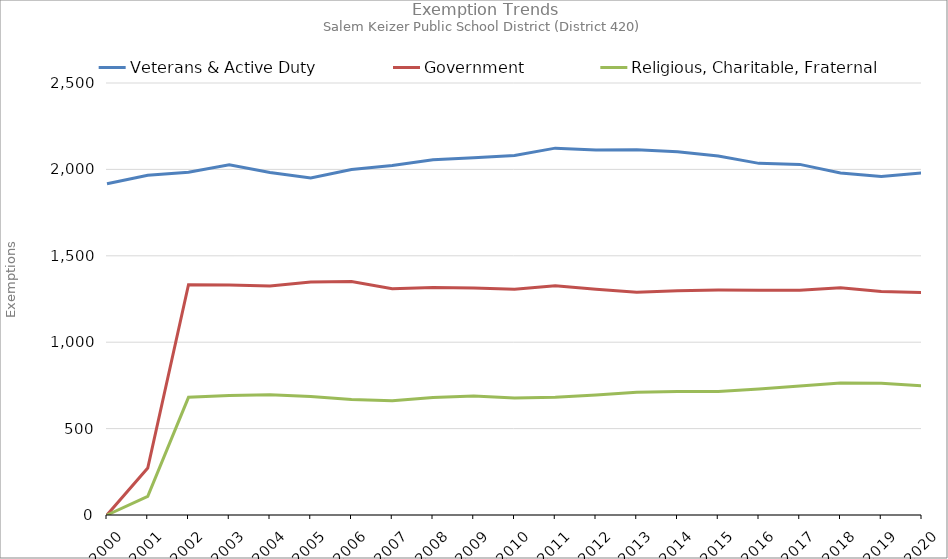
| Category | Veterans & Active Duty | Government | Religious, Charitable, Fraternal |
|---|---|---|---|
| 2000.0 | 1917 | 0 | 0 |
| 2001.0 | 1966 | 272 | 108 |
| 2002.0 | 1984 | 1333 | 681 |
| 2003.0 | 2027 | 1331 | 691 |
| 2004.0 | 1982 | 1325 | 696 |
| 2005.0 | 1950 | 1349 | 686 |
| 2006.0 | 1999 | 1351 | 669 |
| 2007.0 | 2023 | 1310 | 661 |
| 2008.0 | 2056 | 1316 | 680 |
| 2009.0 | 2067 | 1313 | 688 |
| 2010.0 | 2081 | 1306 | 677 |
| 2011.0 | 2123 | 1327 | 681 |
| 2012.0 | 2112 | 1306 | 694 |
| 2013.0 | 2113 | 1289 | 710 |
| 2014.0 | 2102 | 1298 | 715 |
| 2015.0 | 2077 | 1302 | 715 |
| 2016.0 | 2035 | 1301 | 729 |
| 2017.0 | 2029 | 1301 | 747 |
| 2018.0 | 1979 | 1315 | 764 |
| 2019.0 | 1959 | 1293 | 763 |
| 2020.0 | 1979 | 1287 | 748 |